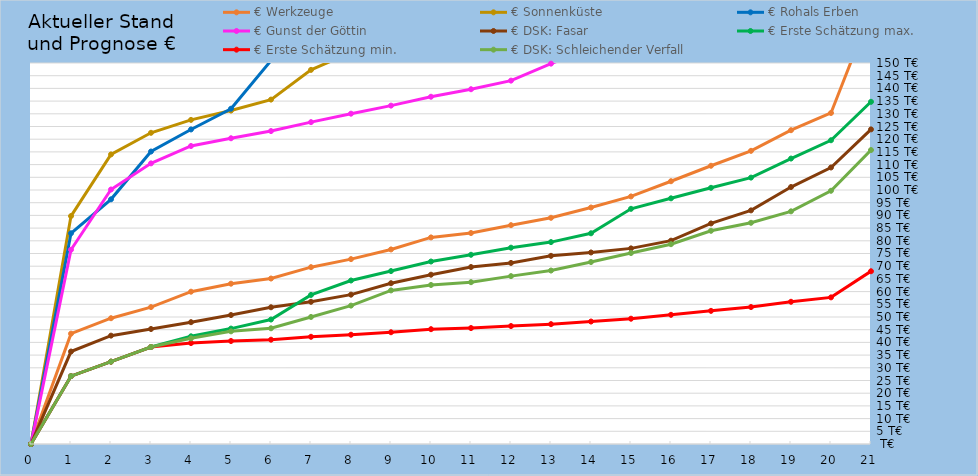
| Category | € Werkzeuge | € Sonnenküste | € Rohals Erben | € Gunst der Göttin | € DSK: Fasar | € Erste Schätzung max. | € Erste Schätzung min. | € DSK: Schleichender Verfall |
|---|---|---|---|---|---|---|---|---|
| 0.0 | 0 | 0 | 0 | 0 | 0 | 0 | 0 | 0 |
| 1.0 | 43437 | 89735 | 82966 | 76466 | 36402 | 26725 | 26725 | 26725 |
| 2.0 | 49522 | 114003 | 96328 | 100197 | 42659 | 32416 | 32416 | 32416 |
| 3.0 | 53901 | 122519 | 115147 | 110488 | 45273 | 38191 | 38191 | 38191 |
| 4.0 | 59963 | 127604 | 123834 | 117325 | 47957 | 42398.144 | 39740.829 | 41597 |
| 5.0 | 63115 | 131274 | 132002 | 120368 | 50763 | 45434.568 | 40546.679 | 44358 |
| 6.0 | 65148 | 135593 | 150957 | 123198 | 53829 | 49007.951 | 41066.441 | 45558 |
| 7.0 | 69623 | 147297 | 164491 | 126713 | 55981 | 58691.414 | 42210.533 | 50019 |
| 8.0 | 72783 | 154154 | 182858 | 130050 | 58795 | 64364.646 | 43018.428 | 54482 |
| 9.0 | 76597 | 158642 | 195000 | 133215 | 63300 | 68077.853 | 43993.527 | 60464 |
| 10.0 | 81327 | 163194 | 203877 | 136715 | 66650 | 71844.012 | 45202.812 | 62608 |
| 11.0 | 83062 | 166405 | 212794 | 139670 | 69668 | 74500.676 | 45646.388 | 63707 |
| 12.0 | 86154 | 169780 | 221864 | 143057 | 71286 | 77293.028 | 46436.897 | 66094 |
| 13.0 | 89062 | 172436 | 229701 | 149744 | 74079 | 79490.506 | 47180.365 | 68288 |
| 14.0 | 93109 | 176629 | 240791 | 155980 | 75411 | 82959.641 | 48215.033 | 71648 |
| 15.0 | 97466 | 188273 | 249000 | 165152 | 77016 | 92593.462 | 49328.957 | 75191 |
| 16.0 | 103452 | 193264 | 257666 | 174081 | 80049 | 96722.834 | 50859.355 | 78668 |
| 17.0 | 109547 | 198261 | 268894 | 181054 | 86833 | 100857.169 | 52417.621 | 83940 |
| 18.0 | 115420 | 203119 | 280832 | 187527 | 91974 | 104876.501 | 53919.13 | 87091 |
| 19.0 | 123542 | 212186 | 299641 | 197700 | 101170 | 112378.207 | 55995.624 | 91598 |
| 20.0 | 130324 | 220897 | 330836 | 205967 | 108862 | 119585.37 | 57729.531 | 99702 |
| 21.0 | 170541 | 239188 | 389236 | 231697 | 123868 | 134718.677 | 68011.528 | 115733 |